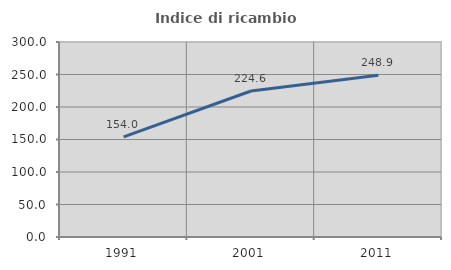
| Category | Indice di ricambio occupazionale  |
|---|---|
| 1991.0 | 153.988 |
| 2001.0 | 224.603 |
| 2011.0 | 248.855 |